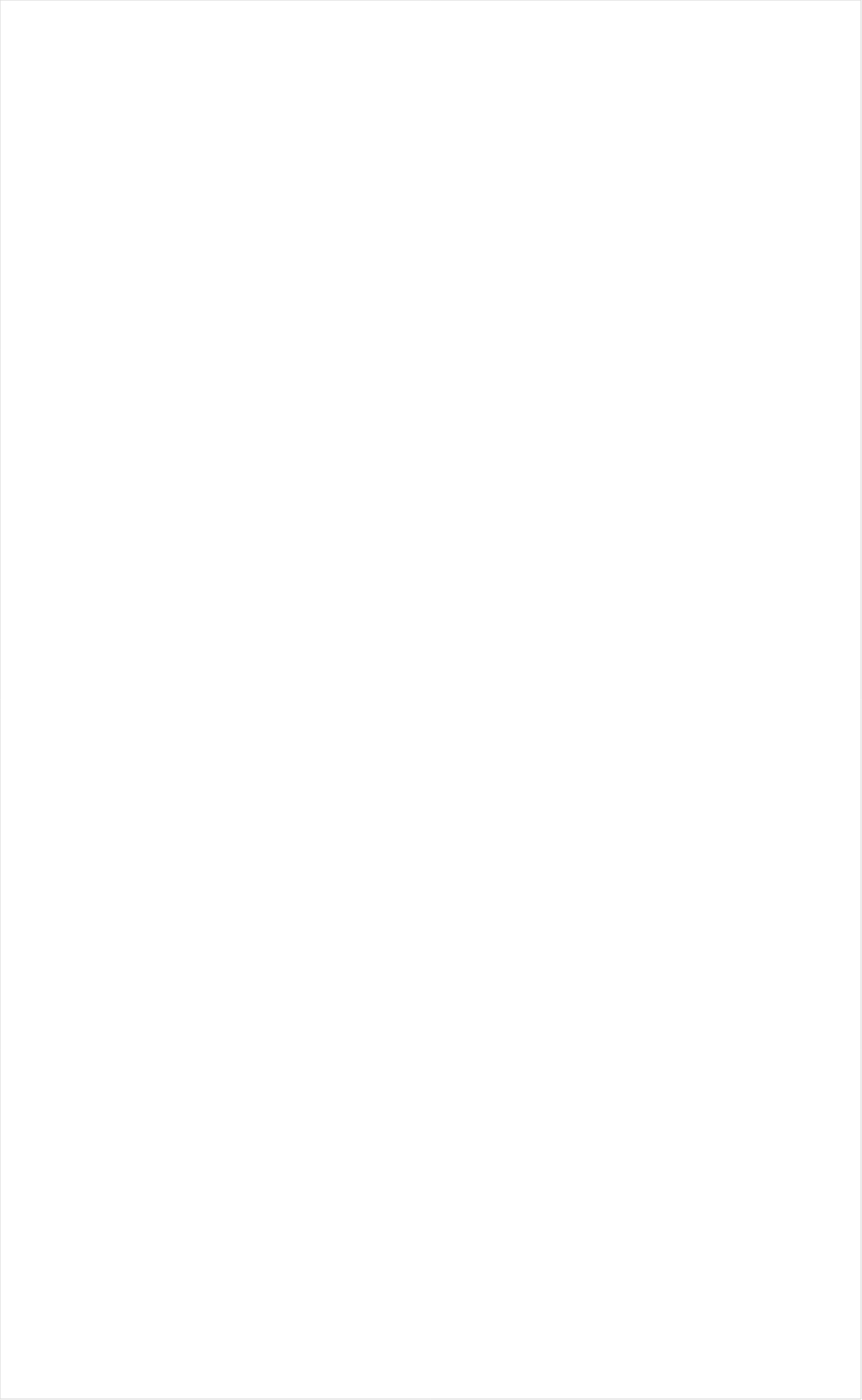
| Category | Total |
|---|---|
| RFD TV | -0.288 |
| PAC-12 Network | -0.256 |
| Tennis Channel | -0.248 |
| Hallmark Movies & Mysteries | -0.184 |
| Smithsonian | -0.184 |
| Olympic Channel | -0.159 |
| Fox Business | -0.153 |
| INSP | -0.153 |
| MSNBC | -0.142 |
| CBS Sports | -0.139 |
| PBS | -0.134 |
| Science Channel | -0.122 |
| Hallmark | -0.113 |
| ESPNU | -0.113 |
| CBS | -0.11 |
| History Channel | -0.109 |
| Fox News | -0.108 |
| National Geographic Wild | -0.103 |
| Outdoor Channel | -0.097 |
| SundanceTV | -0.088 |
| NBC | -0.088 |
| BBC America | -0.087 |
| Weather Channel | -0.084 |
| DIY | -0.083 |
| American Heroes Channel | -0.083 |
| POP | -0.079 |
| FOX Sports 2 | -0.077 |
| ABC | -0.077 |
| Golf | -0.073 |
| Logo | -0.067 |
| Motor Trend Network | -0.066 |
| Reelz Channel | -0.065 |
| Fox Sports 1 | -0.064 |
| Cooking Channel | -0.062 |
| OXYGEN | -0.061 |
| TV LAND | -0.06 |
| NBC Sports | -0.056 |
| HGTV | -0.054 |
| National Geographic | -0.052 |
| FXDEP | -0.052 |
| Destination America | -0.052 |
| Discovery Channel | -0.051 |
| CW | -0.051 |
| Great American Country | -0.049 |
| CNN | -0.049 |
| Animal Planet | -0.049 |
| WGN America | -0.048 |
| Game Show | -0.048 |
| CMTV | -0.047 |
| FYI | -0.045 |
| NHL | -0.044 |
| Investigation Discovery | -0.04 |
| Bloomberg HD | -0.039 |
| Headline News | -0.036 |
| ION | -0.034 |
| FOX | -0.027 |
| Ovation | -0.026 |
| Travel | -0.023 |
| Oprah Winfrey Network | -0.018 |
| UP TV | -0.016 |
| Discovery Family Channel | -0.016 |
| Food Network | -0.014 |
| AMC | -0.011 |
| Paramount Network | -0.006 |
| ESPNEWS | -0.006 |
| Big Ten Network | -0.004 |
| The Sportsman Channel | -0.004 |
| Independent Film (IFC) | 0.001 |
| BET Her | 0.001 |
| MLB Network | 0.008 |
| WE TV | 0.01 |
| Lifetime Movies | 0.017 |
| BRAVO | 0.017 |
| TNT | 0.017 |
| Lifetime | 0.021 |
| ESPN2 | 0.022 |
| NFL Network | 0.024 |
| USA Network | 0.025 |
| A&E | 0.025 |
| TLC | 0.025 |
| FX Movie Channel | 0.025 |
| TBS | 0.027 |
| TV ONE | 0.036 |
| CNBC | 0.037 |
| SYFY | 0.037 |
| E! | 0.045 |
| MyNetworkTV | 0.047 |
| FX | 0.049 |
| ESPN Deportes | 0.053 |
| FXX | 0.055 |
| ESPN | 0.057 |
| NBA TV | 0.059 |
| Discovery Life Channel | 0.065 |
| Viceland | 0.094 |
| Disney XD | 0.096 |
| Disney Channel | 0.104 |
| truTV | 0.104 |
| BET | 0.109 |
| Freeform | 0.114 |
| Teen Nick | 0.119 |
| Nick@Nite | 0.124 |
| Universal Kids | 0.136 |
| Comedy Central | 0.14 |
| Nick | 0.171 |
| Nick Toons | 0.177 |
| Adult Swim | 0.178 |
| MTV | 0.188 |
| VH1 | 0.188 |
| Telemundo | 0.205 |
| MTV2 | 0.22 |
| Univision | 0.229 |
| NBC Universo | 0.235 |
| UniMas | 0.268 |
| Galavision | 0.272 |
| TUDN | 0.318 |
| Nick Jr. | 0.327 |
| Disney Junior US | 0.347 |
| Cartoon Network | 0.376 |